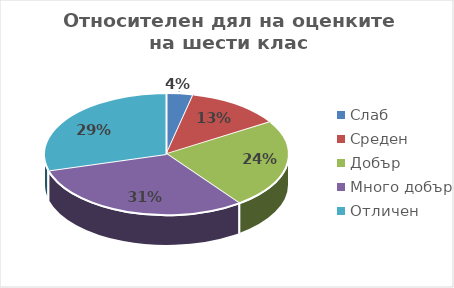
| Category | Series 0 |
|---|---|
| Слаб | 7 |
| Среден | 25 |
| Добър | 47 |
| Много добър | 61 |
| Отличен | 58 |